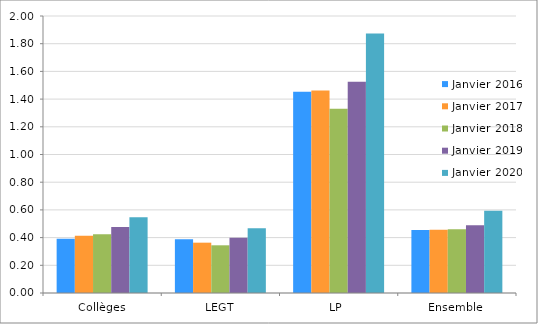
| Category | Janvier 2016 | Janvier 2017 | Janvier 2018 | Janvier 2019 | Janvier 2020 |
|---|---|---|---|---|---|
| Collèges | 0.392 | 0.413 | 0.424 | 0.477 | 0.546 |
| LEGT | 0.388 | 0.363 | 0.344 | 0.4 | 0.468 |
| LP  | 1.453 | 1.462 | 1.331 | 1.526 | 1.873 |
| Ensemble | 0.455 | 0.456 | 0.461 | 0.49 | 0.593 |